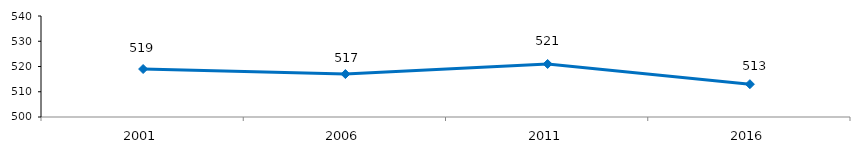
| Category | Textes narratifs |
|---|---|
| 2001.0 | 519 |
| 2006.0 | 517 |
| 2011.0 | 521 |
| 2016.0 | 513 |